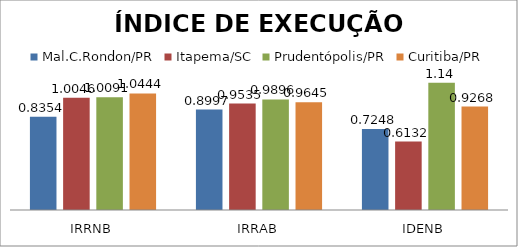
| Category | Mal.C.Rondon/PR | Itapema/SC | Prudentópolis/PR | Toledo/PR | Cascavel/PR | Curitiba/PR |
|---|---|---|---|---|---|---|
| IRRNB | 0.835 | 1.005 | 1.009 |  |  | 1.044 |
| IRRAB | 0.9 | 0.954 | 0.99 |  |  | 0.965 |
| IDENB | 0.725 | 0.613 | 1.14 |  |  | 0.927 |